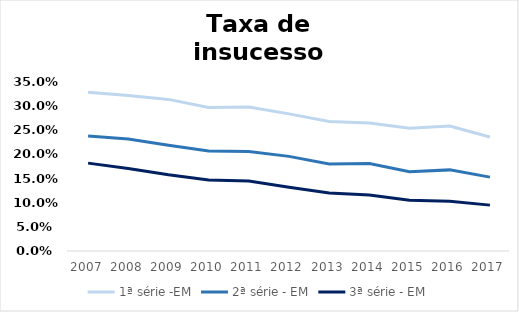
| Category | 1ª série -EM | 2ª série - EM | 3ª série - EM |
|---|---|---|---|
| 2007.0 | 0.329 | 0.238 | 0.182 |
| 2008.0 | 0.322 | 0.232 | 0.171 |
| 2009.0 | 0.314 | 0.219 | 0.158 |
| 2010.0 | 0.297 | 0.207 | 0.147 |
| 2011.0 | 0.298 | 0.206 | 0.145 |
| 2012.0 | 0.284 | 0.196 | 0.132 |
| 2013.0 | 0.268 | 0.18 | 0.12 |
| 2014.0 | 0.265 | 0.181 | 0.116 |
| 2015.0 | 0.254 | 0.164 | 0.105 |
| 2016.0 | 0.259 | 0.168 | 0.103 |
| 2017.0 | 0.236 | 0.153 | 0.095 |